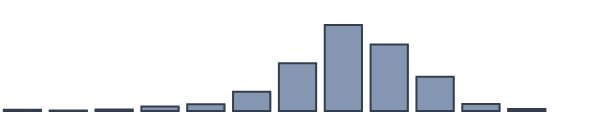
| Category | Series 0 |
|---|---|
| 0 | 0.478 |
| 1 | 0.217 |
| 2 | 0.565 |
| 3 | 1.609 |
| 4 | 2.435 |
| 5 | 6.957 |
| 6 | 17.217 |
| 7 | 30.957 |
| 8 | 23.957 |
| 9 | 12.304 |
| 10 | 2.565 |
| 11 | 0.739 |
| 12 | 0 |